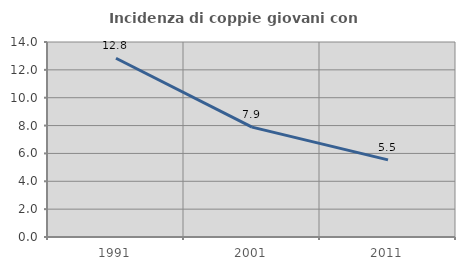
| Category | Incidenza di coppie giovani con figli |
|---|---|
| 1991.0 | 12.832 |
| 2001.0 | 7.888 |
| 2011.0 | 5.536 |